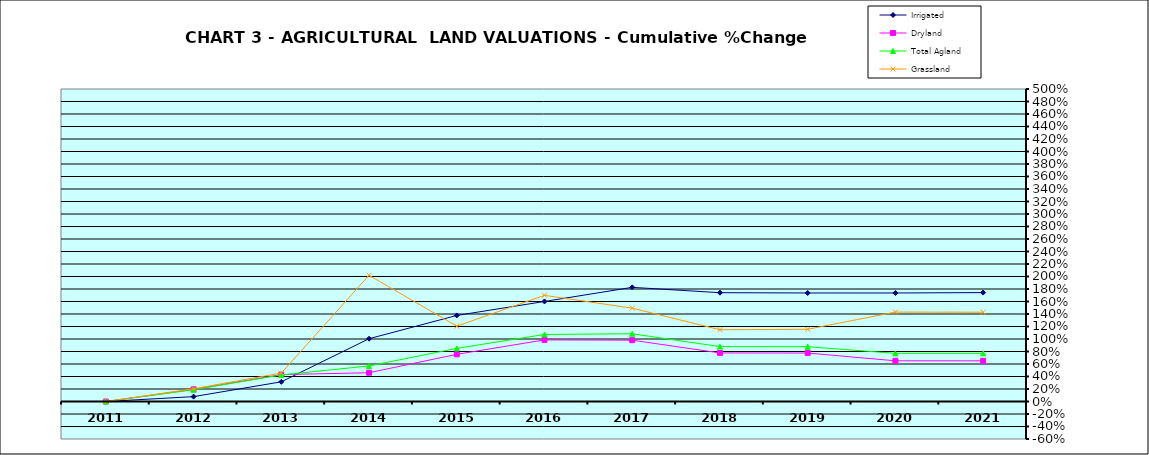
| Category | Irrigated | Dryland | Total Agland | Grassland |
|---|---|---|---|---|
| 2011.0 | 0 | 0 | 0 | 0 |
| 2012.0 | 0.078 | 0.195 | 0.188 | 0.203 |
| 2013.0 | 0.315 | 0.431 | 0.425 | 0.455 |
| 2014.0 | 1.005 | 0.46 | 0.569 | 2.019 |
| 2015.0 | 1.377 | 0.755 | 0.85 | 1.206 |
| 2016.0 | 1.601 | 0.986 | 1.073 | 1.699 |
| 2017.0 | 1.826 | 0.981 | 1.084 | 1.493 |
| 2018.0 | 1.741 | 0.777 | 0.878 | 1.148 |
| 2019.0 | 1.736 | 0.775 | 0.877 | 1.155 |
| 2020.0 | 1.736 | 0.651 | 0.771 | 1.431 |
| 2021.0 | 1.743 | 0.651 | 0.771 | 1.428 |